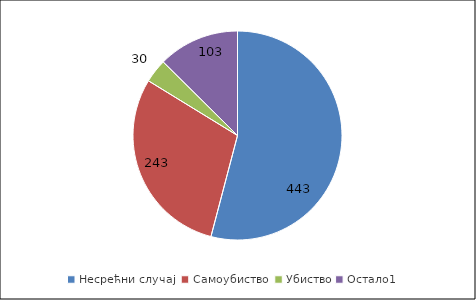
| Category | Жене |
|---|---|
| Несрећни случај  | 443 |
| Самоубиство  | 243 |
| Убиство | 30 |
| Остало1 | 103 |